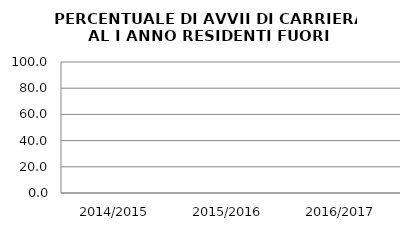
| Category | 2014/2015 2015/2016 2016/2017 |
|---|---|
| 2014/2015 | 0 |
| 2015/2016 | 0 |
| 2016/2017 | 0 |